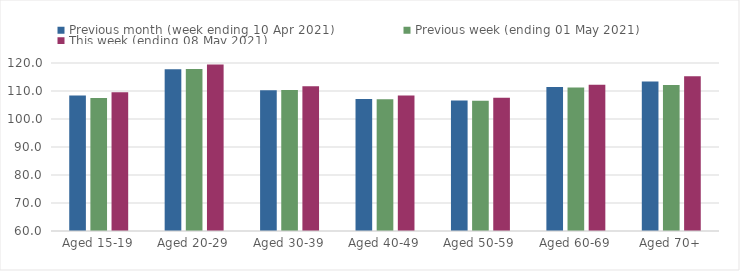
| Category | Previous month (week ending 10 Apr 2021) | Previous week (ending 01 May 2021) | This week (ending 08 May 2021) |
|---|---|---|---|
| Aged 15-19 | 108.4 | 107.54 | 109.54 |
| Aged 20-29 | 117.8 | 117.86 | 119.42 |
| Aged 30-39 | 110.31 | 110.32 | 111.72 |
| Aged 40-49 | 107.11 | 107.05 | 108.39 |
| Aged 50-59 | 106.61 | 106.5 | 107.63 |
| Aged 60-69 | 111.41 | 111.23 | 112.2 |
| Aged 70+ | 113.4 | 112.15 | 115.25 |